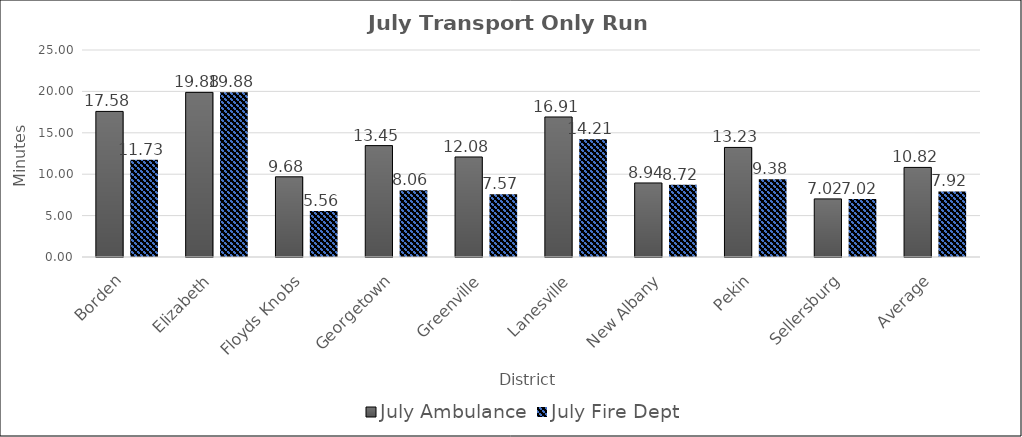
| Category | July |
|---|---|
| Borden | 11.733 |
| Elizabeth | 19.883 |
| Floyds Knobs | 5.556 |
| Georgetown | 8.062 |
| Greenville | 7.57 |
| Lanesville | 14.208 |
| New Albany | 8.72 |
| Pekin | 9.383 |
| Sellersburg | 7.017 |
| Average | 7.92 |